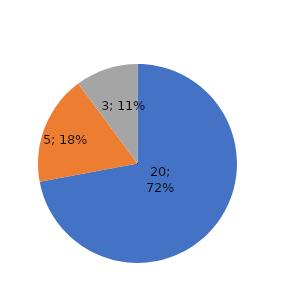
| Category | SR Nevršno |
|---|---|
| Neobezbjeđeno | 20.292 |
| EP BiH | 5.004 |
| ERS | 2.861 |
| EP HZHB | 0 |